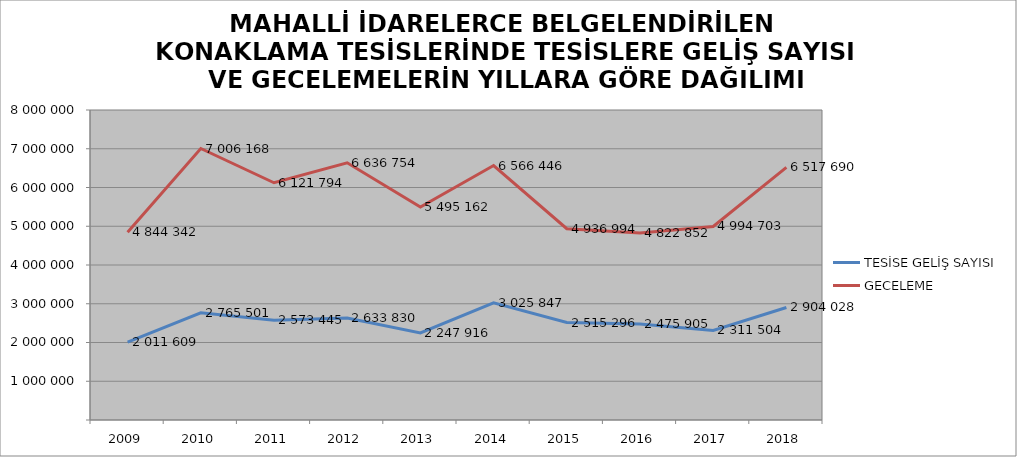
| Category | TESİSE GELİŞ SAYISI | GECELEME |
|---|---|---|
| 2009 | 2011609 | 4844342 |
| 2010 | 2765501 | 7006168 |
| 2011 | 2573445 | 6121794 |
| 2012 | 2633830 | 6636754 |
| 2013 | 2247916 | 5495162 |
| 2014 | 3025847 | 6566446 |
| 2015 | 2515296 | 4936994 |
| 2016 | 2475905 | 4822852 |
| 2017 | 2311504 | 4994703 |
| 2018 | 2904028 | 6517690 |